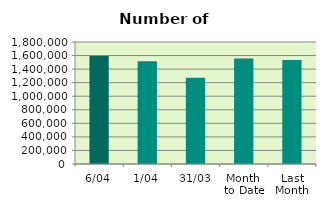
| Category | Series 0 |
|---|---|
| 6/04 | 1595192 |
| 1/04 | 1515240 |
| 31/03 | 1270802 |
| Month 
to Date | 1555216 |
| Last
Month | 1535393.739 |